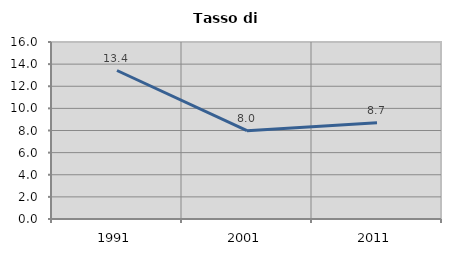
| Category | Tasso di disoccupazione   |
|---|---|
| 1991.0 | 13.424 |
| 2001.0 | 7.981 |
| 2011.0 | 8.699 |